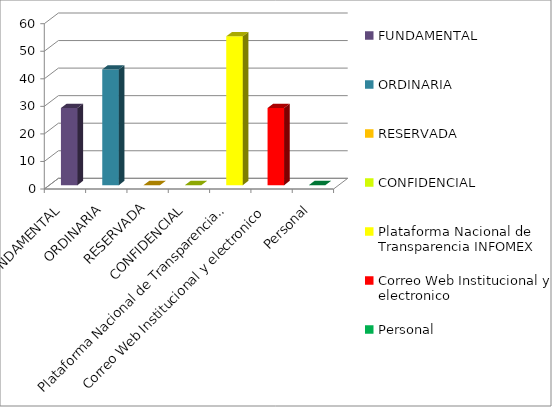
| Category | Series 2 |
|---|---|
| FUNDAMENTAL | 28 |
| ORDINARIA | 42 |
| RESERVADA | 0 |
| CONFIDENCIAL | 0 |
| Plataforma Nacional de Transparencia INFOMEX | 54 |
| Correo Web Institucional y electronico | 28 |
| Personal | 0 |